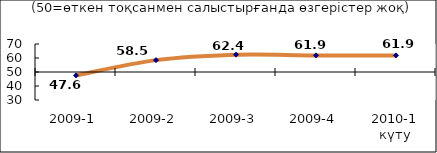
| Category | Диф.индекс ↓ |
|---|---|
| 2009-1 | 47.575 |
| 2009-2 | 58.475 |
| 2009-3 | 62.395 |
| 2009-4 | 61.865 |
| 2010-1 күту | 61.865 |